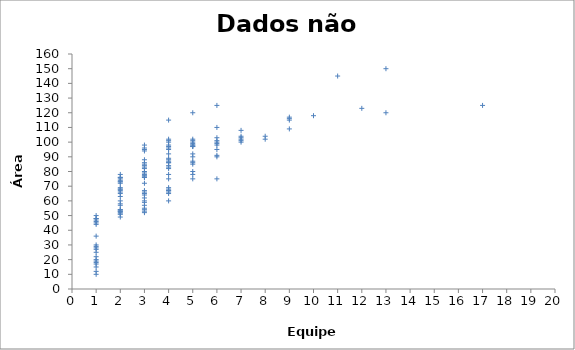
| Category | Series 0 |
|---|---|
| 1.0 | 10 |
| 1.0 | 12 |
| 1.0 | 15 |
| 1.0 | 17 |
| 1.0 | 18 |
| 1.0 | 19 |
| 1.0 | 20 |
| 1.0 | 22 |
| 1.0 | 25 |
| 1.0 | 27 |
| 1.0 | 28 |
| 1.0 | 29 |
| 1.0 | 30 |
| 1.0 | 36 |
| 1.0 | 44 |
| 1.0 | 45 |
| 1.0 | 46 |
| 1.0 | 47 |
| 1.0 | 48 |
| 1.0 | 48 |
| 1.0 | 50 |
| 2.0 | 49 |
| 2.0 | 51 |
| 2.0 | 51 |
| 2.0 | 52 |
| 2.0 | 53 |
| 2.0 | 53 |
| 2.0 | 53 |
| 2.0 | 54 |
| 2.0 | 54 |
| 2.0 | 57 |
| 2.0 | 58 |
| 2.0 | 60 |
| 2.0 | 63 |
| 2.0 | 65 |
| 2.0 | 66 |
| 2.0 | 67 |
| 2.0 | 68 |
| 2.0 | 68 |
| 2.0 | 69 |
| 2.0 | 72 |
| 2.0 | 73 |
| 2.0 | 73 |
| 2.0 | 74 |
| 2.0 | 75 |
| 2.0 | 76 |
| 2.0 | 76 |
| 2.0 | 78 |
| 3.0 | 52 |
| 3.0 | 53 |
| 3.0 | 54 |
| 3.0 | 55 |
| 3.0 | 57 |
| 3.0 | 59 |
| 3.0 | 60 |
| 3.0 | 62 |
| 3.0 | 64 |
| 3.0 | 65 |
| 3.0 | 66 |
| 3.0 | 67 |
| 3.0 | 72 |
| 3.0 | 76 |
| 3.0 | 76 |
| 3.0 | 77 |
| 3.0 | 77 |
| 3.0 | 78 |
| 3.0 | 79 |
| 3.0 | 80 |
| 3.0 | 82 |
| 3.0 | 83 |
| 3.0 | 84 |
| 3.0 | 85 |
| 3.0 | 86 |
| 3.0 | 88 |
| 3.0 | 94 |
| 3.0 | 95 |
| 3.0 | 96 |
| 3.0 | 98 |
| 4.0 | 60 |
| 4.0 | 65 |
| 4.0 | 66 |
| 4.0 | 67 |
| 4.0 | 67 |
| 4.0 | 68 |
| 4.0 | 69 |
| 4.0 | 75 |
| 4.0 | 78 |
| 4.0 | 82 |
| 4.0 | 83 |
| 4.0 | 84 |
| 4.0 | 86 |
| 4.0 | 86 |
| 4.0 | 87 |
| 4.0 | 88 |
| 4.0 | 89 |
| 4.0 | 92 |
| 4.0 | 95 |
| 4.0 | 96 |
| 4.0 | 97 |
| 4.0 | 98 |
| 4.0 | 100 |
| 4.0 | 101 |
| 4.0 | 102 |
| 4.0 | 115 |
| 5.0 | 75 |
| 5.0 | 78 |
| 5.0 | 80 |
| 5.0 | 85 |
| 5.0 | 86 |
| 5.0 | 87 |
| 5.0 | 90 |
| 5.0 | 92 |
| 5.0 | 97 |
| 5.0 | 97 |
| 5.0 | 98 |
| 5.0 | 98 |
| 5.0 | 99 |
| 5.0 | 100 |
| 5.0 | 101 |
| 5.0 | 102 |
| 5.0 | 120 |
| 6.0 | 75 |
| 6.0 | 90 |
| 6.0 | 91 |
| 6.0 | 95 |
| 6.0 | 98 |
| 6.0 | 99 |
| 6.0 | 100 |
| 6.0 | 101 |
| 6.0 | 103 |
| 6.0 | 110 |
| 6.0 | 125 |
| 7.0 | 100 |
| 7.0 | 101 |
| 7.0 | 102 |
| 7.0 | 103 |
| 7.0 | 104 |
| 7.0 | 108 |
| 8.0 | 102 |
| 8.0 | 104 |
| 9.0 | 109 |
| 9.0 | 115 |
| 9.0 | 116 |
| 9.0 | 117 |
| 10.0 | 118 |
| 11.0 | 145 |
| 12.0 | 123 |
| 13.0 | 120 |
| 13.0 | 150 |
| 17.0 | 125 |